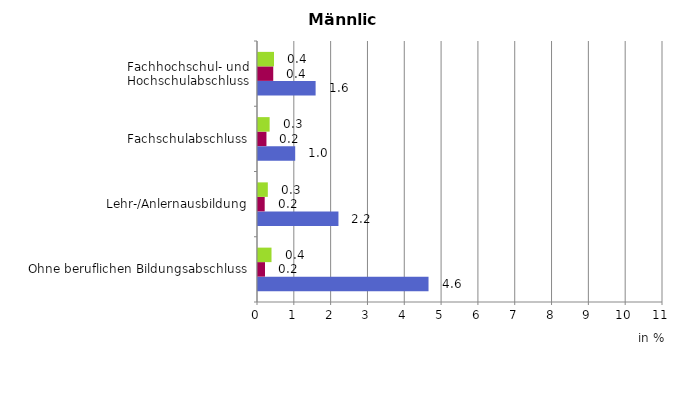
| Category | Series 0 | Series 1 | Series 2 |
|---|---|---|---|
| Ohne beruflichen Bildungsabschluss | 4.632 | 0.19 | 0.367 |
| Lehr-/Anlernausbildung | 2.185 | 0.182 | 0.267 |
| Fachschulabschluss | 1.01 | 0.23 | 0.316 |
| Fachhochschul- und Hochschulabschluss | 1.565 | 0.414 | 0.434 |